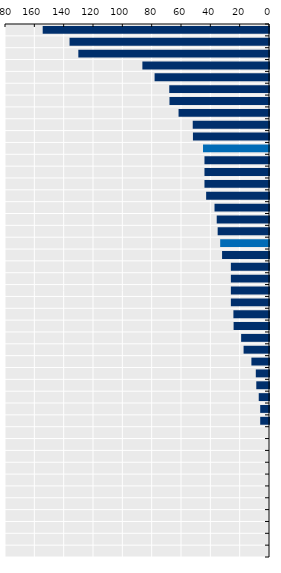
| Category | Length in weeks |
|---|---|
| Finland | 154.3 |
| Hungary | 136 |
| Slovak Republic | 130 |
| Romania | 86.33 |
| Latvia | 78 |
| Norway | 68 |
| Estonia | 67.857 |
| Lithuania | 61.667 |
| Korea | 52 |
| Bulgaria | 51.86 |
| EU average | 44.991 |
| Austria | 44 |
| Germany | 44 |
| Japan | 44 |
| Sweden | 42.857 |
| Slovenia | 37.143 |
| Czechia | 35.645 |
| Canada | 35 |
| OECD average | 33.287 |
| Poland | 32 |
| Luxembourg | 26 |
| Croatia | 26 |
| Italy | 26 |
| France | 26 |
| Greece | 24.267 |
| Portugal | 24.14 |
| Denmark | 19 |
| Belgium | 17.333 |
| Chile | 12 |
| Netherlands | 9 |
| Malta | 8.666 |
| Ireland | 7 |
| Iceland | 6 |
| Australia | 6 |
| Cyprus | 0 |
| United Kingdom | 0 |
| New Zealand | 0 |
| Costa Rica | 0 |
| Spain | 0 |
| Türkiye | 0 |
| Israel | 0 |
| Switzerland | 0 |
| Mexico | 0 |
| United States | 0 |
| Colombia | 0 |